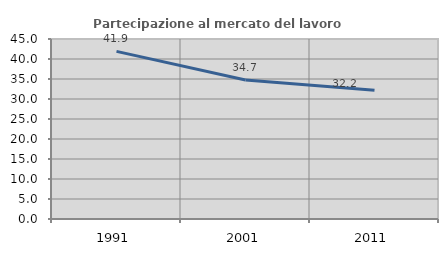
| Category | Partecipazione al mercato del lavoro  femminile |
|---|---|
| 1991.0 | 41.912 |
| 2001.0 | 34.75 |
| 2011.0 | 32.164 |